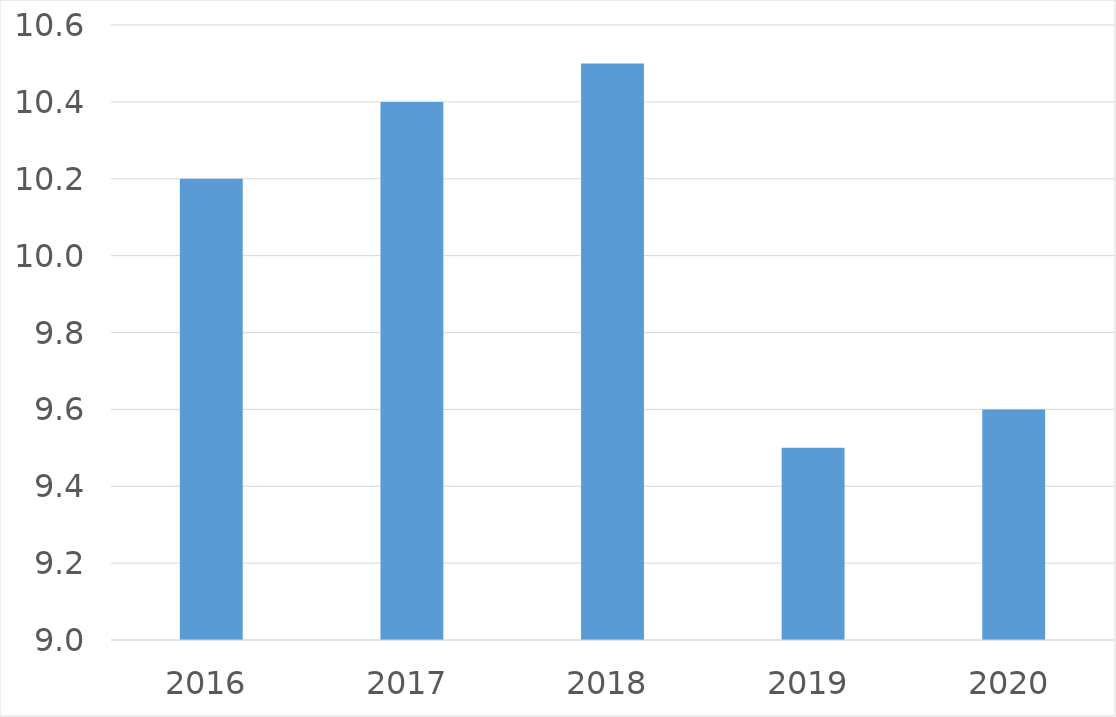
| Category | Series 0 |
|---|---|
| 2016 | 10.2 |
| 2017 | 10.4 |
| 2018 | 10.5 |
| 2019 | 9.5 |
| 2020 | 9.6 |